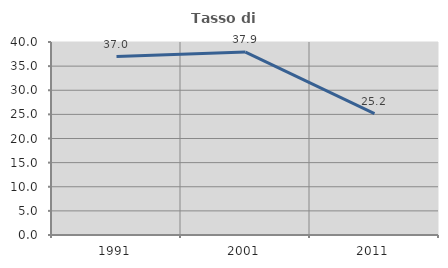
| Category | Tasso di occupazione   |
|---|---|
| 1991.0 | 36.991 |
| 2001.0 | 37.913 |
| 2011.0 | 25.168 |